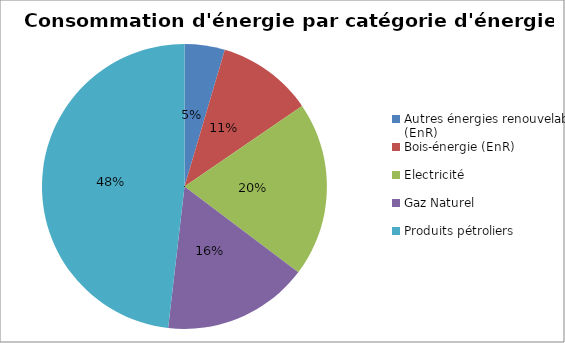
| Category | Series 0 |
|---|---|
| Autres énergies renouvelables (EnR) | 43136.714 |
| Bois-énergie (EnR) | 102566.513 |
| Electricité | 187394.33 |
| Gaz Naturel | 156193.164 |
| Produits pétroliers | 454690.735 |